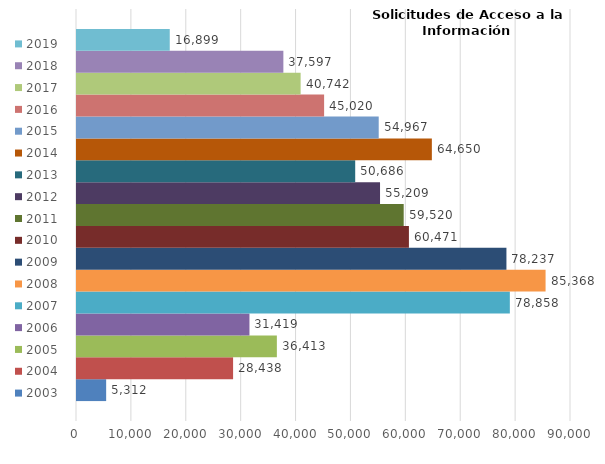
| Category | 2003 | 2004 | 2005 | 2006 | 2007 | 2008 | 2009 | 2010 | 2011 | 2012 | 2013 | 2014 | 2015 | 2016 | 2017 | 2018 | 2019 |
|---|---|---|---|---|---|---|---|---|---|---|---|---|---|---|---|---|---|
| 0 | 5312 | 28438 | 36413 | 31419 | 78858 | 85368 | 78237 | 60471 | 59520 | 55209 | 50686 | 64650 | 54967 | 45020 | 40742 | 37597 | 16899 |